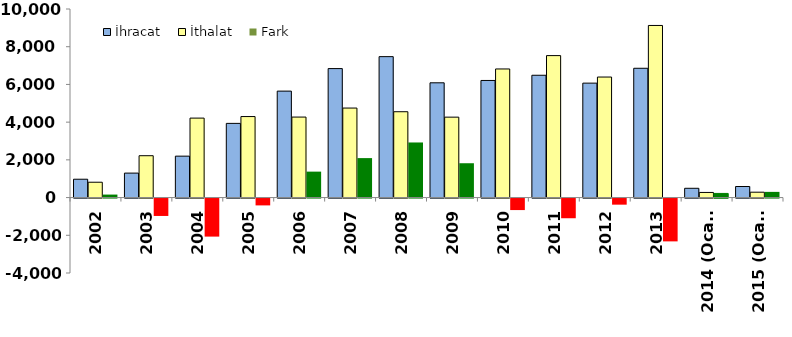
| Category | İhracat | İthalat | Fark |
|---|---|---|---|
| 2002 | 973 | 814 | 159 |
| 2003 | 1298 | 2220 | -922 |
| 2004 | 2197 | 4214 | -2017 |
| 2005 | 3934 | 4296 | -362 |
| 2006 | 5645 | 4269 | 1376 |
| 2007 | 6840 | 4747 | 2093 |
| 2008 | 7474 | 4552 | 2922 |
| 2009 | 6086 | 4265 | 1821 |
| 2010 | 6210 | 6820 | -610 |
| 2011 | 6486 | 7529 | -1043 |
| 2012 | 6069 | 6392 | -323 |
| 2013 | 6857 | 9127 | -2270 |
| 2014 (Ocak) | 492 | 272 | 220 |
| 2015 (Ocak) | 587 | 285 | 302 |